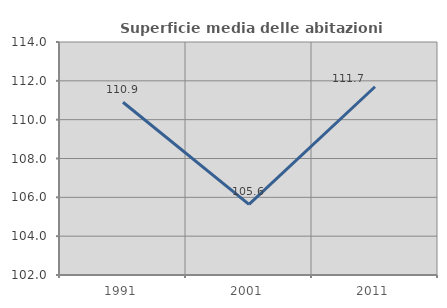
| Category | Superficie media delle abitazioni occupate |
|---|---|
| 1991.0 | 110.897 |
| 2001.0 | 105.638 |
| 2011.0 | 111.696 |